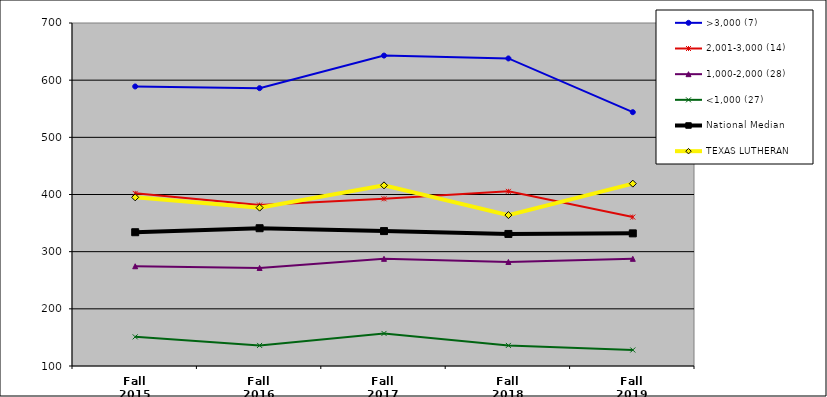
| Category | >3,000 (7) | 2,001-3,000 (14) | 1,000-2,000 (28) | <1,000 (27) | National Median | TEXAS LUTHERAN |
|---|---|---|---|---|---|---|
| Fall 2015 | 589 | 402 | 274.5 | 151 | 334 | 395 |
| Fall 2016 | 586 | 381.5 | 271.5 | 136 | 341 | 377 |
| Fall 2017 | 643 | 392.5 | 287.5 | 157 | 336 | 416 |
| Fall 2018 | 638 | 405.5 | 282 | 136 | 331 | 364 |
| Fall 2019 | 544 | 360.5 | 287.5 | 128 | 332 | 419 |